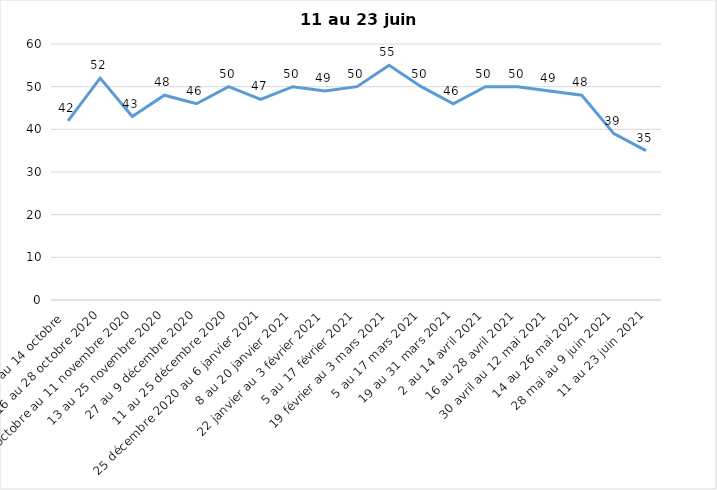
| Category | Toujours aux trois mesures |
|---|---|
| 2 au 14 octobre  | 42 |
| 16 au 28 octobre 2020 | 52 |
| 30 octobre au 11 novembre 2020 | 43 |
| 13 au 25 novembre 2020 | 48 |
| 27 au 9 décembre 2020 | 46 |
| 11 au 25 décembre 2020 | 50 |
| 25 décembre 2020 au 6 janvier 2021 | 47 |
| 8 au 20 janvier 2021 | 50 |
| 22 janvier au 3 février 2021 | 49 |
| 5 au 17 février 2021 | 50 |
| 19 février au 3 mars 2021 | 55 |
| 5 au 17 mars 2021 | 50 |
| 19 au 31 mars 2021 | 46 |
| 2 au 14 avril 2021 | 50 |
| 16 au 28 avril 2021 | 50 |
| 30 avril au 12 mai 2021 | 49 |
| 14 au 26 mai 2021 | 48 |
| 28 mai au 9 juin 2021 | 39 |
| 11 au 23 juin 2021 | 35 |